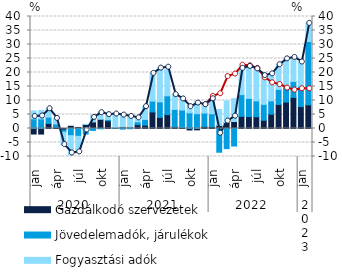
| Category | Gazdálkodó szervezetek | Jövedelemadók, járulékok | Fogyasztási adók |
|---|---|---|---|
| 0 | -1.976 | 3.45 | 2.832 |
| 1 | -1.989 | 3.421 | 3.038 |
| 2 | 1.781 | 2.274 | 3.006 |
| 3 | 0.406 | 1.231 | 1.975 |
| 4 | -0.559 | -0.78 | -4.415 |
| 5 | 0.801 | -2.564 | -6.973 |
| 6 | 0.384 | -2.793 | -5.955 |
| 7 | 1.44 | -1.969 | 0.018 |
| 8 | 2.347 | -0.689 | 2.308 |
| 9 | 3.295 | -0.11 | 2.486 |
| 10 | 2.762 | 0.464 | 1.731 |
| 11 | 0.106 | 0.255 | 4.802 |
| 12 | 0.572 | -0.223 | 4.439 |
| 13 | 0.497 | -0.084 | 3.905 |
| 14 | 1.377 | 1.005 | 1.427 |
| 15 | 1.191 | 2.054 | 4.574 |
| 16 | 5.907 | 3.881 | 9.892 |
| 17 | 3.958 | 5.539 | 12.065 |
| 18 | 4.954 | 6.711 | 10.241 |
| 19 | 0.574 | 6.229 | 5.305 |
| 20 | 0.349 | 6.26 | 3.958 |
| 21 | -0.523 | 5.599 | 2.731 |
| 22 | -0.486 | 5.299 | 4.279 |
| 23 | 0.721 | 4.777 | 3.018 |
| 24 | 0.722 | 4.531 | 5.37 |
| 25 | 1.09 | -8.475 | 5.696 |
| 26 | 2.117 | -7.185 | 7.726 |
| 27 | 2.491 | -6.25 | 8.175 |
| 28 | 4.337 | 7.75 | 9.398 |
| 29 | 4.249 | 6.505 | 11.421 |
| 30 | 4.188 | 5.661 | 11.44 |
| 31 | 2.939 | 5.682 | 10.271 |
| 32 | 5.106 | 4.763 | 9.651 |
| 33 | 8.585 | 5.392 | 8.817 |
| 34 | 9.439 | 5.469 | 9.966 |
| 35 | 11.094 | 5.687 | 8.608 |
| 36 | 7.833 | 7.262 | 8.65 |
| 37 | 8.447 | 22.593 | 6.5 |